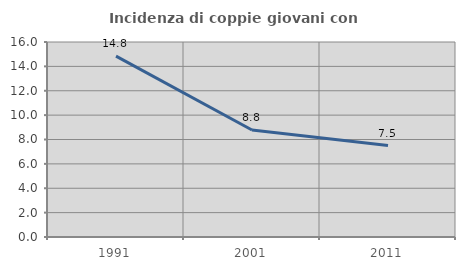
| Category | Incidenza di coppie giovani con figli |
|---|---|
| 1991.0 | 14.845 |
| 2001.0 | 8.777 |
| 2011.0 | 7.503 |